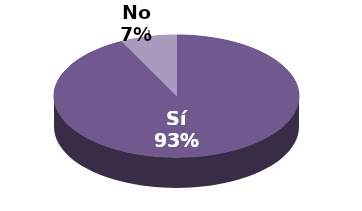
| Category | Series 1 |
|---|---|
| Sí | 25 |
| No | 2 |